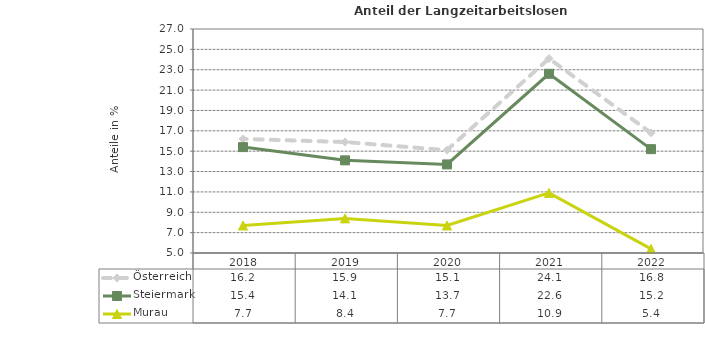
| Category | Österreich | Steiermark | Murau |
|---|---|---|---|
| 2022.0 | 16.8 | 15.2 | 5.4 |
| 2021.0 | 24.1 | 22.6 | 10.9 |
| 2020.0 | 15.1 | 13.7 | 7.7 |
| 2019.0 | 15.9 | 14.1 | 8.4 |
| 2018.0 | 16.2 | 15.4 | 7.7 |